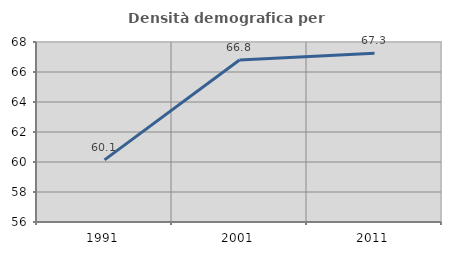
| Category | Densità demografica |
|---|---|
| 1991.0 | 60.141 |
| 2001.0 | 66.798 |
| 2011.0 | 67.252 |